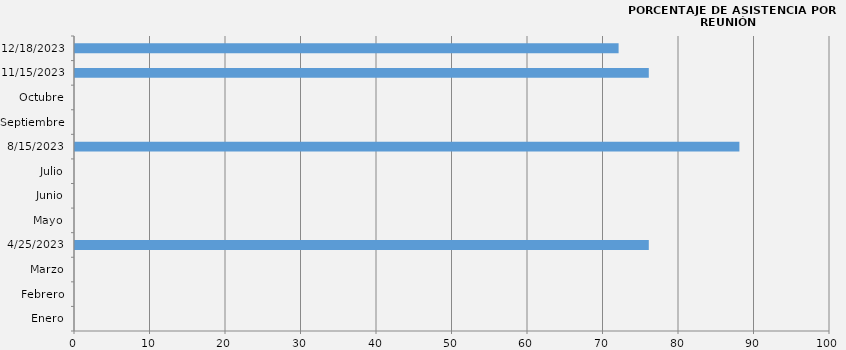
| Category | Enero |
|---|---|
| Enero | 0 |
| Febrero | 0 |
| Marzo | 0 |
| 25/04/2023 | 76 |
| Mayo | 0 |
| Junio | 0 |
| Julio | 0 |
| 15/08/2023 | 88 |
| Septiembre | 0 |
| Octubre | 0 |
| 15/11/2023 | 76 |
| 18/12/2023 | 72 |